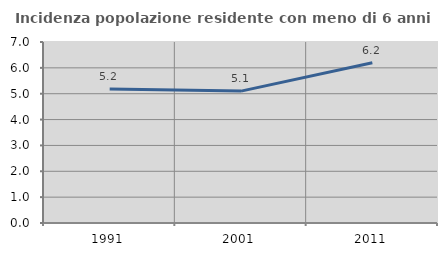
| Category | Incidenza popolazione residente con meno di 6 anni |
|---|---|
| 1991.0 | 5.178 |
| 2001.0 | 5.101 |
| 2011.0 | 6.195 |